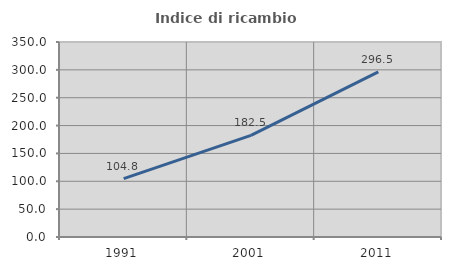
| Category | Indice di ricambio occupazionale  |
|---|---|
| 1991.0 | 104.762 |
| 2001.0 | 182.5 |
| 2011.0 | 296.491 |